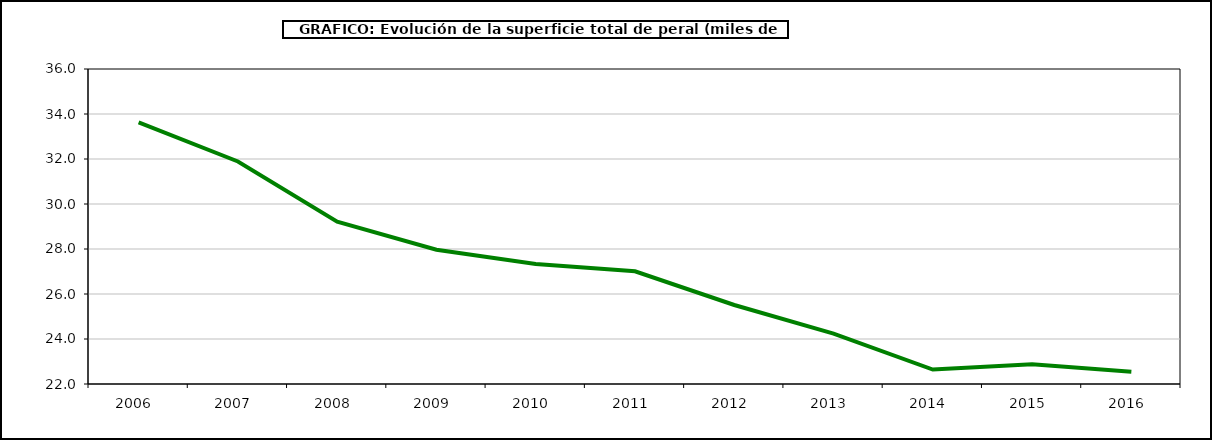
| Category | superficie peral |
|---|---|
| 2006.0 | 33.63 |
| 2007.0 | 31.891 |
| 2008.0 | 29.216 |
| 2009.0 | 27.967 |
| 2010.0 | 27.331 |
| 2011.0 | 27.01 |
| 2012.0 | 25.512 |
| 2013.0 | 24.243 |
| 2014.0 | 22.643 |
| 2015.0 | 22.878 |
| 2016.0 | 22.547 |